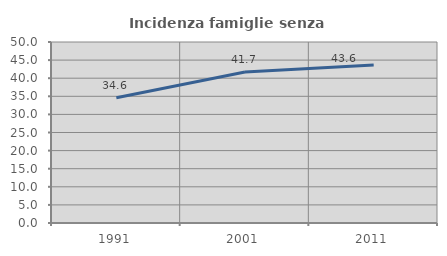
| Category | Incidenza famiglie senza nuclei |
|---|---|
| 1991.0 | 34.584 |
| 2001.0 | 41.73 |
| 2011.0 | 43.645 |